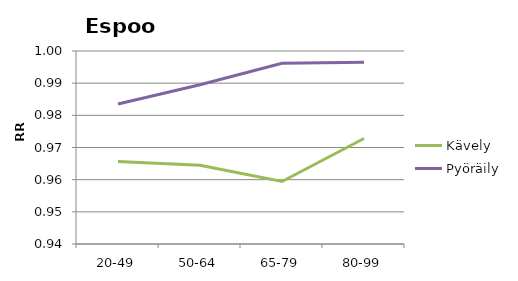
| Category | Kävely | Pyöräily |
|---|---|---|
| 20-49 | 0.966 | 0.984 |
| 50-64 | 0.964 | 0.99 |
| 65-79 | 0.959 | 0.996 |
| 80-99 | 0.973 | 0.996 |